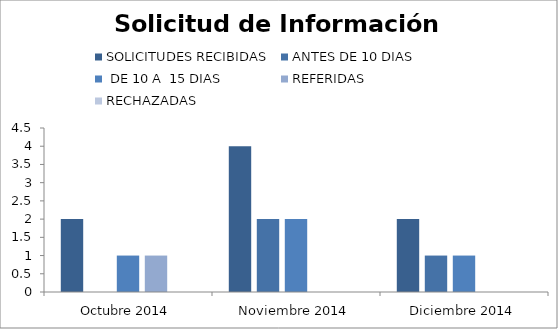
| Category | SOLICITUDES RECIBIDAS | ANTES DE 10 DIAS |  DE 10 A  15 DIAS  | REFERIDAS | RECHAZADAS |
|---|---|---|---|---|---|
| Octubre 2014 | 2 | 0 | 1 | 1 | 0 |
| Noviembre 2014 | 4 | 2 | 2 | 0 | 0 |
| Diciembre 2014 | 2 | 1 | 1 | 0 | 0 |